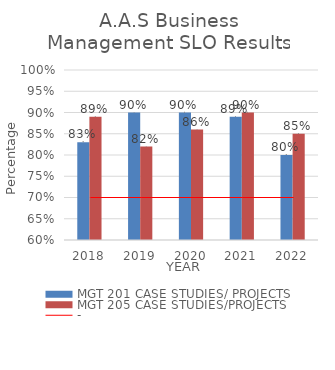
| Category | MGT 201 CASE STUDIES/ PROJECTS | MGT 205 CASE STUDIES/PROJECTS |
|---|---|---|
| 0 | 0.83 | 0.89 |
| 1 | 0.9 | 0.82 |
| 2 | 0.9 | 0.86 |
| 3 | 0.89 | 0.9 |
| 4 | 0.8 | 0.85 |